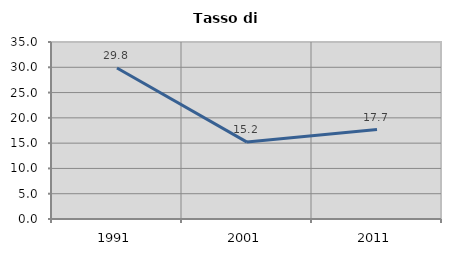
| Category | Tasso di disoccupazione   |
|---|---|
| 1991.0 | 29.847 |
| 2001.0 | 15.203 |
| 2011.0 | 17.677 |